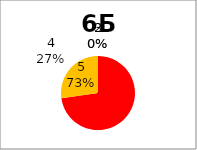
| Category | Series 0 |
|---|---|
| 5.0 | 8 |
| 4.0 | 3 |
| 3.0 | 0 |
| 2.0 | 0 |